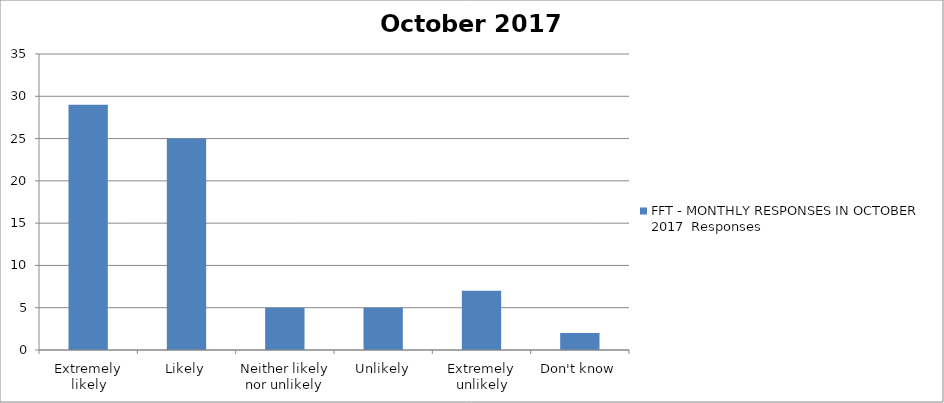
| Category | FFT - MONTHLY RESPONSES IN OCTOBER 2017 Responses |
|---|---|
| Extremely likely | 29 |
| Likely | 25 |
| Neither likely nor unlikely | 5 |
| Unlikely | 5 |
| Extremely unlikely | 7 |
| Don't know | 2 |